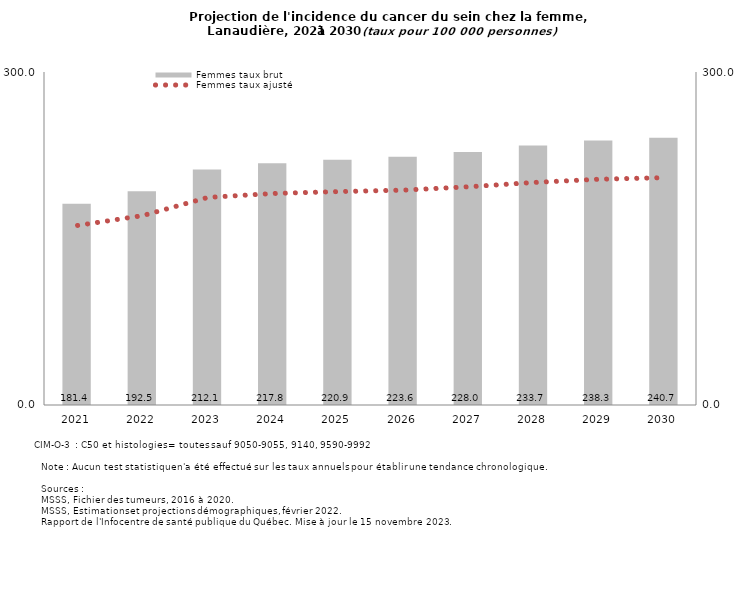
| Category | Femmes taux brut |
|---|---|
| 2021.0 | 181.381 |
| 2022.0 | 192.515 |
| 2023.0 | 212.145 |
| 2024.0 | 217.833 |
| 2025.0 | 220.946 |
| 2026.0 | 223.557 |
| 2027.0 | 228.008 |
| 2028.0 | 233.692 |
| 2029.0 | 238.305 |
| 2030.0 | 240.712 |